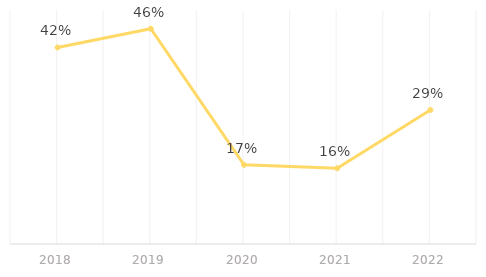
| Category | Series 0 |
|---|---|
| 2018.0 | 0.42 |
| 2019.0 | 0.46 |
| 2020.0 | 0.169 |
| 2021.0 | 0.162 |
| 2022.0 | 0.286 |